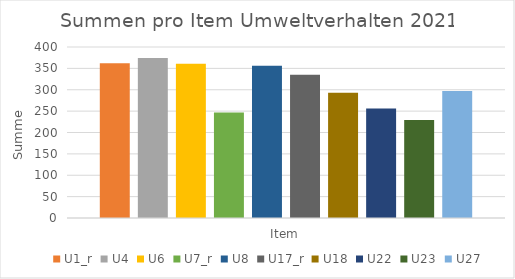
| Category | U1_r | U4 | U6 | U7_r | U8 | U17_r | U18 | U22 | U23 | U27 |
|---|---|---|---|---|---|---|---|---|---|---|
| Item | 362 | 374 | 361 | 247 | 356 | 335 | 293 | 256 | 229 | 297 |